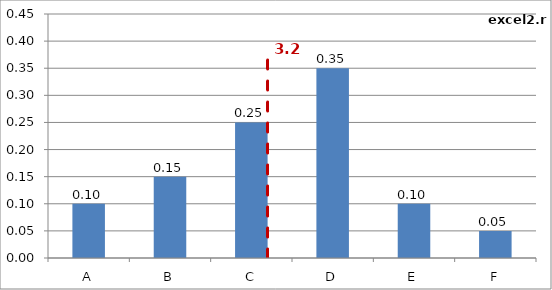
| Category | Series 0 |
|---|---|
| A | 0.1 |
| B | 0.15 |
| C | 0.25 |
| D | 0.35 |
| E | 0.1 |
| F | 0.05 |